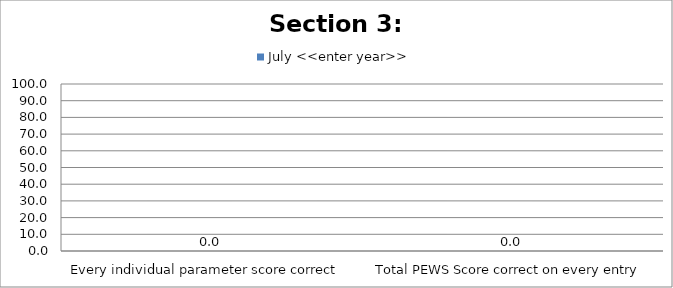
| Category | July <<enter year>> |
|---|---|
| Every individual parameter score correct  | 0 |
| Total PEWS Score correct on every entry | 0 |